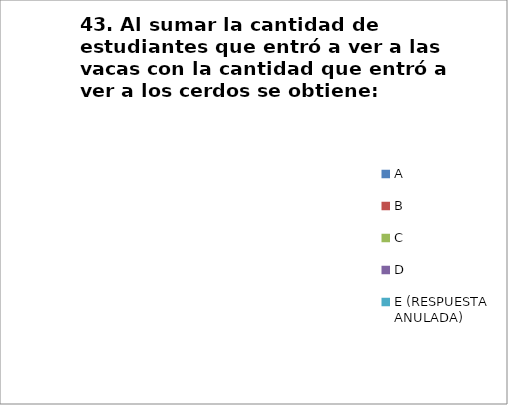
| Category | CANTIDAD DE RESPUESTAS PREGUNTA (43) | PORCENTAJE |
|---|---|---|
| A | 0 | 0 |
| B | 0 | 0 |
| C | 0 | 0 |
| D | 0 | 0 |
| E (RESPUESTA ANULADA) | 0 | 0 |